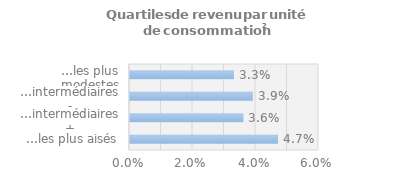
| Category | Series 0 |
|---|---|
| …les plus aisés | 0.047 |
| …intermédiaires + | 0.036 |
| …intermédiaires - | 0.039 |
| …les plus modestes | 0.033 |